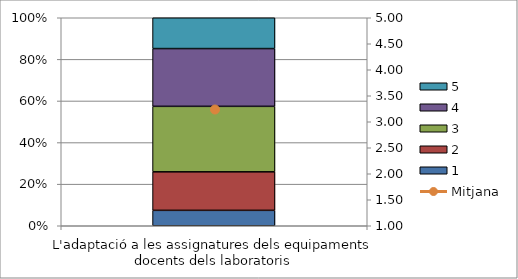
| Category | 1 | 2 | 3 | 4 | 5 |
|---|---|---|---|---|---|
| L'adaptació a les assignatures dels equipaments docents dels laboratoris | 4 | 10 | 17 | 15 | 8 |